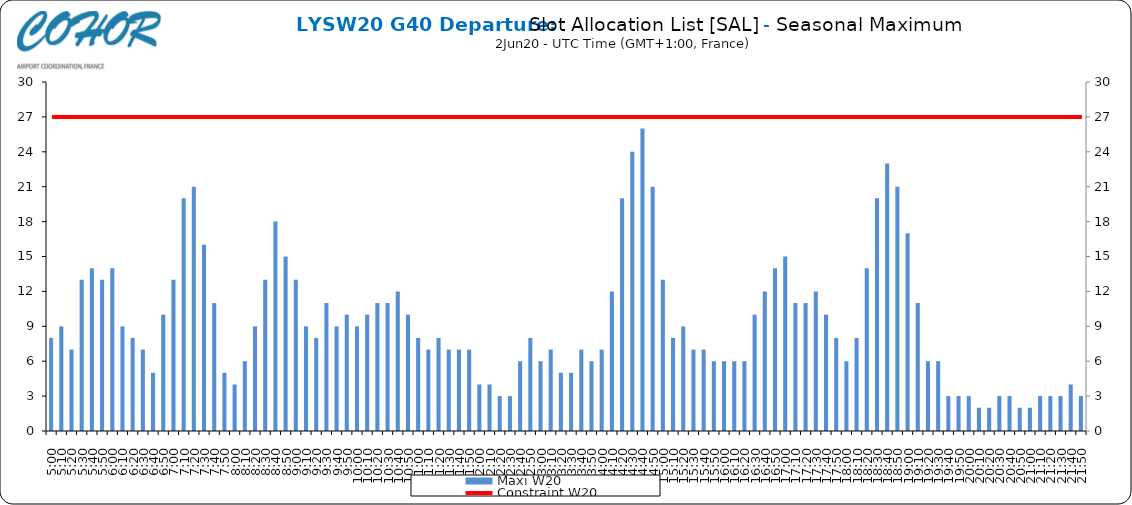
| Category | Maxi W20 |
|---|---|
| 0.20833333333333334 | 8 |
| 0.2152777777777778 | 9 |
| 0.2222222222222222 | 7 |
| 0.22916666666666666 | 13 |
| 0.23611111111111113 | 14 |
| 0.24305555555555555 | 13 |
| 0.25 | 14 |
| 0.2569444444444445 | 9 |
| 0.2638888888888889 | 8 |
| 0.2708333333333333 | 7 |
| 0.2777777777777778 | 5 |
| 0.2847222222222222 | 10 |
| 0.2916666666666667 | 13 |
| 0.2986111111111111 | 20 |
| 0.3055555555555555 | 21 |
| 0.3125 | 16 |
| 0.3194444444444445 | 11 |
| 0.3263888888888889 | 5 |
| 0.3333333333333333 | 4 |
| 0.34027777777777773 | 6 |
| 0.34722222222222227 | 9 |
| 0.3541666666666667 | 13 |
| 0.3611111111111111 | 18 |
| 0.3680555555555556 | 15 |
| 0.375 | 13 |
| 0.3819444444444444 | 9 |
| 0.3888888888888889 | 8 |
| 0.3958333333333333 | 11 |
| 0.40277777777777773 | 9 |
| 0.40972222222222227 | 10 |
| 0.4166666666666667 | 9 |
| 0.4236111111111111 | 10 |
| 0.4305555555555556 | 11 |
| 0.4375 | 11 |
| 0.4444444444444444 | 12 |
| 0.4513888888888889 | 10 |
| 0.4583333333333333 | 8 |
| 0.46527777777777773 | 7 |
| 0.47222222222222227 | 8 |
| 0.4791666666666667 | 7 |
| 0.4861111111111111 | 7 |
| 0.4930555555555556 | 7 |
| 0.5 | 4 |
| 0.5069444444444444 | 4 |
| 0.513888888888889 | 3 |
| 0.5208333333333334 | 3 |
| 0.5277777777777778 | 6 |
| 0.5347222222222222 | 8 |
| 0.5416666666666666 | 6 |
| 0.548611111111111 | 7 |
| 0.5555555555555556 | 5 |
| 0.5625 | 5 |
| 0.5694444444444444 | 7 |
| 0.576388888888889 | 6 |
| 0.5833333333333334 | 7 |
| 0.5902777777777778 | 12 |
| 0.5972222222222222 | 20 |
| 0.6041666666666666 | 24 |
| 0.611111111111111 | 26 |
| 0.6180555555555556 | 21 |
| 0.625 | 13 |
| 0.6319444444444444 | 8 |
| 0.638888888888889 | 9 |
| 0.6458333333333334 | 7 |
| 0.6527777777777778 | 7 |
| 0.6597222222222222 | 6 |
| 0.6666666666666666 | 6 |
| 0.6736111111111112 | 6 |
| 0.6805555555555555 | 6 |
| 0.6875 | 10 |
| 0.6944444444444445 | 12 |
| 0.7013888888888888 | 14 |
| 0.7083333333333334 | 15 |
| 0.7152777777777778 | 11 |
| 0.7222222222222222 | 11 |
| 0.7291666666666666 | 12 |
| 0.7361111111111112 | 10 |
| 0.7430555555555555 | 8 |
| 0.75 | 6 |
| 0.7569444444444445 | 8 |
| 0.7638888888888888 | 14 |
| 0.7708333333333334 | 20 |
| 0.7777777777777778 | 23 |
| 0.7847222222222222 | 21 |
| 0.7916666666666666 | 17 |
| 0.7986111111111112 | 11 |
| 0.8055555555555555 | 6 |
| 0.8125 | 6 |
| 0.8194444444444445 | 3 |
| 0.8263888888888888 | 3 |
| 0.8333333333333334 | 3 |
| 0.8402777777777778 | 2 |
| 0.8472222222222222 | 2 |
| 0.8541666666666666 | 3 |
| 0.8611111111111112 | 3 |
| 0.8680555555555555 | 2 |
| 0.875 | 2 |
| 0.8819444444444445 | 3 |
| 0.8888888888888888 | 3 |
| 0.8958333333333334 | 3 |
| 0.9027777777777778 | 4 |
| 0.9097222222222222 | 3 |